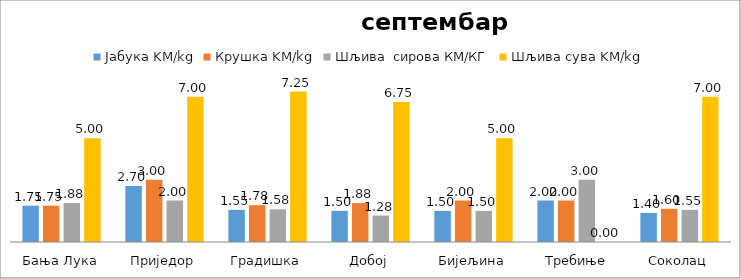
| Category | Јабука KM/kg | Крушка KM/kg | Шљива  сирова КМ/КГ | Шљива сува KM/kg |
|---|---|---|---|---|
| Бања Лука | 1.75 | 1.75 | 1.875 | 5 |
| Приједор | 2.7 | 3 | 2 | 7 |
| Градишка | 1.55 | 1.775 | 1.575 | 7.25 |
| Добој | 1.5 | 1.875 | 1.275 | 6.75 |
| Бијељина | 1.5 | 2 | 1.5 | 5 |
|  Требиње | 2 | 2 | 3 | 0 |
| Соколац | 1.4 | 1.6 | 1.55 | 7 |